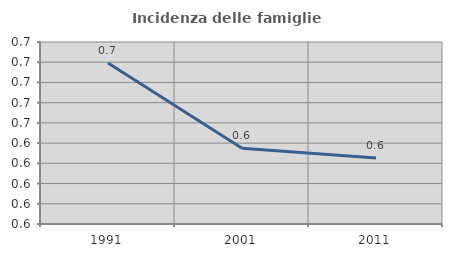
| Category | Incidenza delle famiglie numerose |
|---|---|
| 1991.0 | 0.709 |
| 2001.0 | 0.625 |
| 2011.0 | 0.615 |